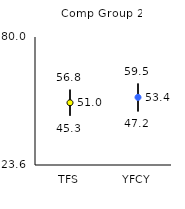
| Category | 25th | 75th | Mean |
|---|---|---|---|
| TFS | 45.3 | 56.8 | 51.03 |
| YFCY | 47.2 | 59.5 | 53.41 |